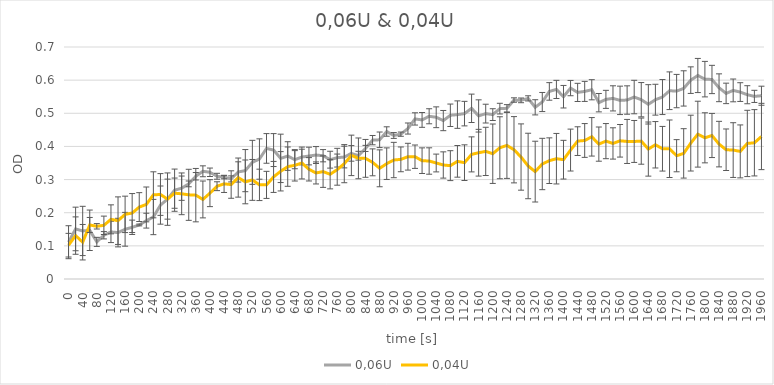
| Category | 0,06U | 0,04U |
|---|---|---|
| 0.0 | 0.111 | 0.102 |
| 20.0 | 0.151 | 0.131 |
| 40.0 | 0.145 | 0.111 |
| 60.0 | 0.147 | 0.163 |
| 80.0 | 0.112 | 0.159 |
| 100.0 | 0.132 | 0.162 |
| 120.0 | 0.142 | 0.18 |
| 140.0 | 0.14 | 0.176 |
| 160.0 | 0.15 | 0.195 |
| 180.0 | 0.156 | 0.199 |
| 200.0 | 0.163 | 0.217 |
| 220.0 | 0.176 | 0.225 |
| 240.0 | 0.187 | 0.254 |
| 260.0 | 0.223 | 0.255 |
| 280.0 | 0.241 | 0.241 |
| 300.0 | 0.268 | 0.259 |
| 320.0 | 0.274 | 0.257 |
| 340.0 | 0.287 | 0.254 |
| 360.0 | 0.31 | 0.253 |
| 380.0 | 0.325 | 0.24 |
| 400.0 | 0.322 | 0.259 |
| 420.0 | 0.31 | 0.28 |
| 440.0 | 0.307 | 0.287 |
| 460.0 | 0.302 | 0.285 |
| 480.0 | 0.323 | 0.306 |
| 500.0 | 0.327 | 0.293 |
| 520.0 | 0.352 | 0.299 |
| 540.0 | 0.362 | 0.284 |
| 560.0 | 0.394 | 0.284 |
| 580.0 | 0.389 | 0.308 |
| 600.0 | 0.364 | 0.325 |
| 620.0 | 0.371 | 0.339 |
| 640.0 | 0.36 | 0.343 |
| 660.0 | 0.368 | 0.35 |
| 680.0 | 0.371 | 0.331 |
| 700.0 | 0.374 | 0.32 |
| 720.0 | 0.372 | 0.324 |
| 740.0 | 0.36 | 0.316 |
| 760.0 | 0.366 | 0.33 |
| 780.0 | 0.368 | 0.348 |
| 800.0 | 0.379 | 0.373 |
| 820.0 | 0.372 | 0.364 |
| 840.0 | 0.394 | 0.364 |
| 860.0 | 0.419 | 0.352 |
| 880.0 | 0.42 | 0.334 |
| 900.0 | 0.445 | 0.348 |
| 920.0 | 0.433 | 0.359 |
| 940.0 | 0.437 | 0.361 |
| 960.0 | 0.454 | 0.369 |
| 980.0 | 0.483 | 0.369 |
| 1000.0 | 0.48 | 0.357 |
| 1020.0 | 0.491 | 0.356 |
| 1040.0 | 0.488 | 0.35 |
| 1060.0 | 0.478 | 0.344 |
| 1080.0 | 0.494 | 0.342 |
| 1100.0 | 0.496 | 0.355 |
| 1120.0 | 0.499 | 0.351 |
| 1140.0 | 0.515 | 0.376 |
| 1160.0 | 0.492 | 0.381 |
| 1180.0 | 0.499 | 0.385 |
| 1200.0 | 0.496 | 0.378 |
| 1220.0 | 0.514 | 0.396 |
| 1240.0 | 0.515 | 0.403 |
| 1260.0 | 0.54 | 0.39 |
| 1280.0 | 0.539 | 0.368 |
| 1300.0 | 0.545 | 0.341 |
| 1320.0 | 0.518 | 0.324 |
| 1340.0 | 0.534 | 0.347 |
| 1360.0 | 0.566 | 0.357 |
| 1380.0 | 0.572 | 0.363 |
| 1400.0 | 0.55 | 0.36 |
| 1420.0 | 0.576 | 0.389 |
| 1440.0 | 0.563 | 0.416 |
| 1460.0 | 0.566 | 0.418 |
| 1480.0 | 0.571 | 0.429 |
| 1500.0 | 0.532 | 0.407 |
| 1520.0 | 0.542 | 0.416 |
| 1540.0 | 0.545 | 0.409 |
| 1560.0 | 0.539 | 0.417 |
| 1580.0 | 0.54 | 0.415 |
| 1600.0 | 0.549 | 0.415 |
| 1620.0 | 0.541 | 0.416 |
| 1640.0 | 0.527 | 0.392 |
| 1660.0 | 0.541 | 0.405 |
| 1680.0 | 0.549 | 0.393 |
| 1700.0 | 0.568 | 0.393 |
| 1720.0 | 0.567 | 0.372 |
| 1740.0 | 0.575 | 0.379 |
| 1760.0 | 0.6 | 0.41 |
| 1780.0 | 0.614 | 0.437 |
| 1800.0 | 0.603 | 0.426 |
| 1820.0 | 0.602 | 0.433 |
| 1840.0 | 0.577 | 0.407 |
| 1860.0 | 0.56 | 0.39 |
| 1880.0 | 0.569 | 0.389 |
| 1900.0 | 0.564 | 0.385 |
| 1920.0 | 0.556 | 0.409 |
| 1940.0 | 0.551 | 0.411 |
| 1960.0 | 0.553 | 0.43 |